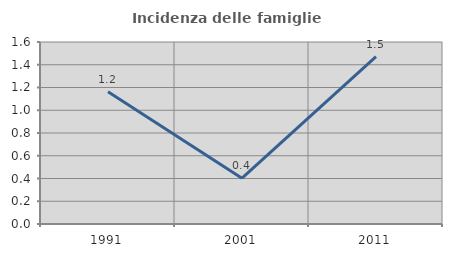
| Category | Incidenza delle famiglie numerose |
|---|---|
| 1991.0 | 1.163 |
| 2001.0 | 0.403 |
| 2011.0 | 1.471 |